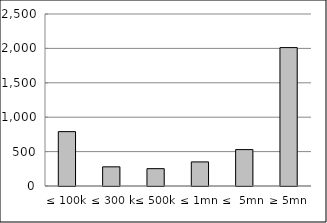
| Category | Series 0 |
|---|---|
| ≤ 100k | 790109599.983 |
| ≤ 300 k | 278592479.722 |
| ≤ 500k | 251980489.95 |
| ≤ 1mn | 349989623.72 |
| ≤  5mn | 529149245.524 |
| ≥ 5mn | 2011506276.855 |